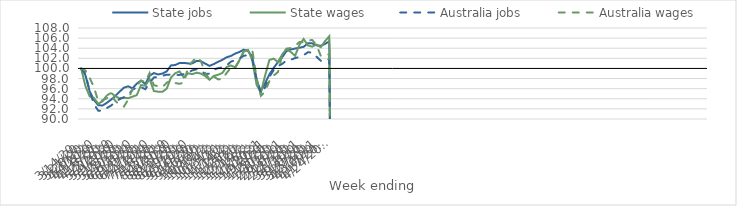
| Category | State jobs | State wages | Australia jobs | Australia wages |
|---|---|---|---|---|
| 14/03/2020 | 100 | 100 | 100 | 100 |
| 21/03/2020 | 98.661 | 96.5 | 98.971 | 99.607 |
| 28/03/2020 | 95.437 | 94.476 | 95.468 | 98.119 |
| 04/04/2020 | 93.77 | 94.156 | 92.921 | 96.261 |
| 11/04/2020 | 92.733 | 93.011 | 91.648 | 93.491 |
| 18/04/2020 | 92.663 | 93.506 | 91.631 | 93.695 |
| 25/04/2020 | 93.196 | 94.663 | 92.161 | 94.112 |
| 02/05/2020 | 93.831 | 95.156 | 92.658 | 94.685 |
| 09/05/2020 | 94.556 | 94.498 | 93.342 | 93.574 |
| 16/05/2020 | 95.414 | 94.106 | 93.935 | 92.809 |
| 23/05/2020 | 96.192 | 94.22 | 94.29 | 92.465 |
| 30/05/2020 | 96.468 | 94.116 | 94.796 | 93.818 |
| 06/06/2020 | 96.07 | 94.417 | 95.779 | 95.924 |
| 13/06/2020 | 96.997 | 94.722 | 96.278 | 96.597 |
| 20/06/2020 | 97.598 | 96.713 | 96.293 | 97.571 |
| 27/06/2020 | 96.905 | 96.579 | 95.898 | 97.324 |
| 04/07/2020 | 98.558 | 97.916 | 97.132 | 99.089 |
| 11/07/2020 | 99.083 | 95.533 | 98.221 | 96.668 |
| 18/07/2020 | 98.812 | 95.398 | 98.324 | 96.5 |
| 25/07/2020 | 98.992 | 95.377 | 98.548 | 96.312 |
| 01/08/2020 | 99.422 | 95.996 | 98.77 | 97.181 |
| 08/08/2020 | 100.603 | 98.212 | 98.766 | 97.601 |
| 15/08/2020 | 100.679 | 99.067 | 98.672 | 97.108 |
| 22/08/2020 | 101.081 | 99.412 | 98.73 | 96.964 |
| 29/08/2020 | 101.094 | 98.209 | 98.866 | 97.198 |
| 05/09/2020 | 100.991 | 99.048 | 99.166 | 100.215 |
| 12/09/2020 | 101.005 | 98.875 | 99.638 | 101.349 |
| 19/09/2020 | 101.504 | 99.161 | 99.835 | 102.253 |
| 26/09/2020 | 101.424 | 98.973 | 99.64 | 101.42 |
| 03/10/2020 | 100.958 | 98.492 | 98.855 | 99.138 |
| 10/10/2020 | 100.504 | 97.753 | 98.997 | 97.834 |
| 17/10/2020 | 100.866 | 98.524 | 99.767 | 98.431 |
| 24/10/2020 | 101.303 | 98.742 | 100.05 | 97.835 |
| 31/10/2020 | 101.701 | 99.106 | 100.228 | 97.89 |
| 07/11/2020 | 102.209 | 100.292 | 100.597 | 99.112 |
| 14/11/2020 | 102.47 | 100.588 | 101.334 | 100.12 |
| 21/11/2020 | 102.936 | 100.231 | 101.652 | 100.166 |
| 28/11/2020 | 103.259 | 101.668 | 101.968 | 101.522 |
| 05/12/2020 | 103.718 | 103.387 | 102.515 | 103.324 |
| 12/12/2020 | 103.45 | 103.681 | 102.583 | 103.755 |
| 19/12/2020 | 102.285 | 101.615 | 101.771 | 103.629 |
| 26/12/2020 | 97.66 | 96.777 | 97.972 | 98.159 |
| 02/01/2021 | 95.514 | 95.209 | 95.021 | 94.58 |
| 09/01/2021 | 97.106 | 98.617 | 96.246 | 95.443 |
| 16/01/2021 | 98.823 | 101.69 | 98.354 | 97.531 |
| 23/01/2021 | 100.112 | 101.942 | 99.666 | 98.597 |
| 30/01/2021 | 101.266 | 101.257 | 100.48 | 99.293 |
| 06/02/2021 | 102.237 | 102.796 | 100.907 | 102.696 |
| 13/02/2021 | 103.435 | 103.818 | 101.592 | 103.915 |
| 20/02/2021 | 103.739 | 103.247 | 101.718 | 104.04 |
| 27/02/2021 | 103.944 | 102.498 | 102.048 | 104.48 |
| 06/03/2021 | 104.097 | 104.666 | 102.273 | 105.217 |
| 13/03/2021 | 104.275 | 105.83 | 102.625 | 105.198 |
| 20/03/2021 | 104.989 | 104.554 | 103.203 | 105.516 |
| 27/03/2021 | 104.958 | 104.307 | 103.136 | 105.634 |
| 03/04/2021 | 104.569 | 104.723 | 102.34 | 104.641 |
| 10/04/2021 | 104.482 | 104.2 | 101.508 | 102.484 |
| 17/04/2021 | 104.846 | 105.404 | 101.424 | 102.692 |
| 24/04/2021 | 105.373 | 106.381 | 101.89 | 102.787 |